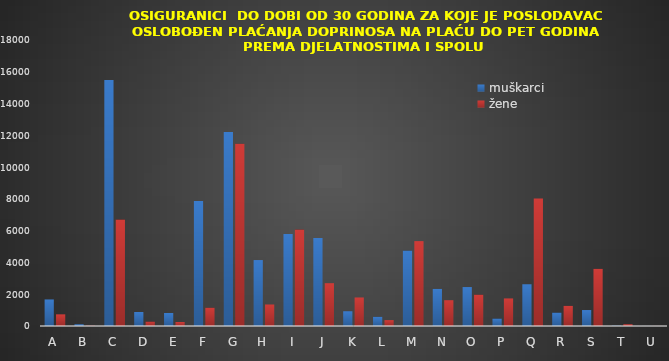
| Category | muškarci | žene |
|---|---|---|
| A | 1671 | 734 |
| B | 109 | 17 |
| C | 15487 | 6698 |
| D | 880 | 276 |
| E | 818 | 251 |
| F | 7866 | 1152 |
| G | 12211 | 11477 |
| H | 4150 | 1354 |
| I | 5785 | 6068 |
| J | 5534 | 2695 |
| K | 929 | 1795 |
| L | 578 | 370 |
| M | 4747 | 5342 |
| N | 2335 | 1624 |
| O | 2451 | 1972 |
| P | 469 | 1735 |
| Q | 2627 | 8029 |
| R | 842 | 1267 |
| S | 1004 | 3597 |
| T | 19 | 111 |
| U | 3 | 5 |